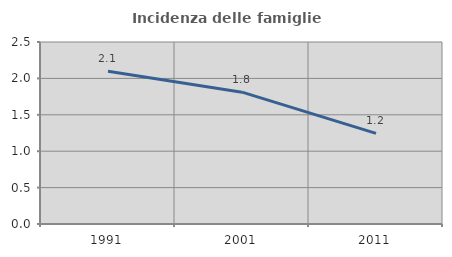
| Category | Incidenza delle famiglie numerose |
|---|---|
| 1991.0 | 2.099 |
| 2001.0 | 1.811 |
| 2011.0 | 1.246 |